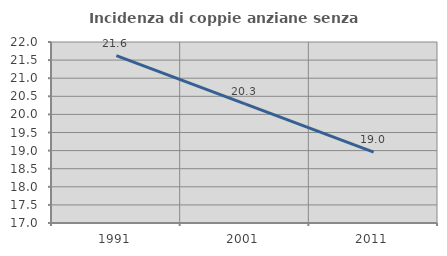
| Category | Incidenza di coppie anziane senza figli  |
|---|---|
| 1991.0 | 21.622 |
| 2001.0 | 20.29 |
| 2011.0 | 18.959 |